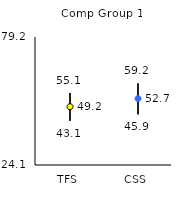
| Category | 25th | 75th | Mean |
|---|---|---|---|
| TFS | 43.1 | 55.1 | 49.2 |
| CSS | 45.9 | 59.2 | 52.69 |